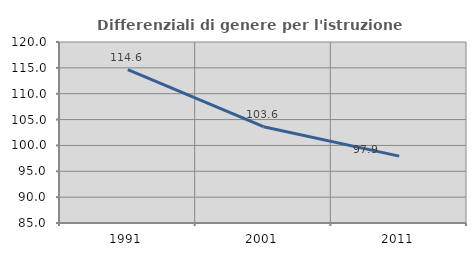
| Category | Differenziali di genere per l'istruzione superiore |
|---|---|
| 1991.0 | 114.648 |
| 2001.0 | 103.621 |
| 2011.0 | 97.929 |